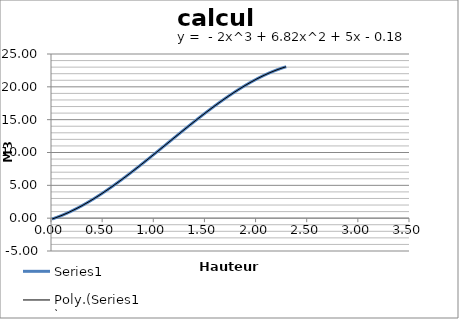
| Category | Series 0 |
|---|---|
| 0.01 | -0.129 |
| 0.02 | -0.077 |
| 0.03 | -0.024 |
| 0.04 | 0.031 |
| 0.05 | 0.087 |
| 0.06 | 0.144 |
| 0.07 | 0.203 |
| 0.08 | 0.263 |
| 0.09 | 0.324 |
| 0.1 | 0.386 |
| 0.11 | 0.45 |
| 0.12 | 0.515 |
| 0.13 | 0.581 |
| 0.14 | 0.648 |
| 0.15 | 0.717 |
| 0.16 | 0.786 |
| 0.17 | 0.857 |
| 0.18 | 0.929 |
| 0.19 | 1.002 |
| 0.2 | 1.077 |
| 0.21 | 1.152 |
| 0.22 | 1.229 |
| 0.23 | 1.306 |
| 0.24 | 1.385 |
| 0.25 | 1.465 |
| 0.26 | 1.546 |
| 0.27 | 1.628 |
| 0.28 | 1.711 |
| 0.29 | 1.795 |
| 0.3 | 1.88 |
| 0.31 | 1.966 |
| 0.32 | 2.053 |
| 0.33 | 2.141 |
| 0.34 | 2.23 |
| 0.35 | 2.32 |
| 0.36 | 2.411 |
| 0.37 | 2.502 |
| 0.38 | 2.595 |
| 0.39 | 2.689 |
| 0.4 | 2.783 |
| 0.41 | 2.879 |
| 0.42 | 2.975 |
| 0.43 | 3.072 |
| 0.44 | 3.17 |
| 0.45 | 3.269 |
| 0.46 | 3.368 |
| 0.47 | 3.469 |
| 0.48 | 3.57 |
| 0.49 | 3.672 |
| 0.5 | 3.775 |
| 0.51 | 3.879 |
| 0.52 | 3.983 |
| 0.53 | 4.088 |
| 0.54 | 4.194 |
| 0.55 | 4.3 |
| 0.56 | 4.408 |
| 0.57 | 4.515 |
| 0.58 | 4.624 |
| 0.59 | 4.733 |
| 0.6 | 4.843 |
| 0.61 | 4.954 |
| 0.62 | 5.065 |
| 0.63 | 5.177 |
| 0.64 | 5.289 |
| 0.65 | 5.402 |
| 0.66 | 5.516 |
| 0.67 | 5.63 |
| 0.68 | 5.745 |
| 0.69 | 5.86 |
| 0.7 | 5.976 |
| 0.71 | 6.092 |
| 0.72 | 6.209 |
| 0.73 | 6.326 |
| 0.74 | 6.444 |
| 0.75 | 6.562 |
| 0.76 | 6.681 |
| 0.77 | 6.801 |
| 0.78 | 6.92 |
| 0.79 | 7.04 |
| 0.8 | 7.161 |
| 0.81 | 7.282 |
| 0.82 | 7.403 |
| 0.83 | 7.525 |
| 0.84 | 7.647 |
| 0.85 | 7.769 |
| 0.86 | 7.892 |
| 0.87 | 8.015 |
| 0.88 | 8.138 |
| 0.89 | 8.262 |
| 0.9 | 8.386 |
| 0.91 | 8.51 |
| 0.92 | 8.635 |
| 0.93 | 8.76 |
| 0.94 | 8.885 |
| 0.95 | 9.01 |
| 0.96 | 9.136 |
| 0.97 | 9.262 |
| 0.98 | 9.388 |
| 0.99 | 9.514 |
| 1.0 | 9.64 |
| 1.01 | 9.766 |
| 1.02 | 9.893 |
| 1.03 | 10.02 |
| 1.04 | 10.147 |
| 1.05 | 10.274 |
| 1.06 | 10.401 |
| 1.07 | 10.528 |
| 1.08 | 10.655 |
| 1.09 | 10.783 |
| 1.1 | 10.91 |
| 1.11 | 11.038 |
| 1.12 | 11.165 |
| 1.13 | 11.293 |
| 1.14 | 11.42 |
| 1.15 | 11.548 |
| 1.16 | 11.675 |
| 1.17 | 11.803 |
| 1.18 | 11.93 |
| 1.19 | 12.057 |
| 1.2 | 12.185 |
| 1.21 | 12.312 |
| 1.22 | 12.439 |
| 1.23 | 12.566 |
| 1.24 | 12.693 |
| 1.25 | 12.82 |
| 1.26 | 12.947 |
| 1.27 | 13.073 |
| 1.28 | 13.2 |
| 1.29 | 13.326 |
| 1.3 | 13.452 |
| 1.31 | 13.578 |
| 1.32 | 13.703 |
| 1.33 | 13.829 |
| 1.34 | 13.954 |
| 1.35 | 14.079 |
| 1.36 | 14.203 |
| 1.37 | 14.328 |
| 1.38 | 14.452 |
| 1.39 | 14.576 |
| 1.4 | 14.699 |
| 1.41 | 14.822 |
| 1.42 | 14.945 |
| 1.43 | 15.068 |
| 1.44 | 15.19 |
| 1.45 | 15.312 |
| 1.46 | 15.433 |
| 1.47 | 15.554 |
| 1.48 | 15.675 |
| 1.49 | 15.795 |
| 1.5 | 15.915 |
| 1.51 | 16.034 |
| 1.52 | 16.153 |
| 1.53 | 16.272 |
| 1.54 | 16.39 |
| 1.55 | 16.507 |
| 1.56 | 16.624 |
| 1.57 | 16.741 |
| 1.58 | 16.857 |
| 1.59 | 16.972 |
| 1.6 | 17.087 |
| 1.61 | 17.202 |
| 1.62 | 17.315 |
| 1.63 | 17.429 |
| 1.64 | 17.541 |
| 1.65 | 17.653 |
| 1.66 | 17.765 |
| 1.67 | 17.875 |
| 1.68 | 17.986 |
| 1.69 | 18.095 |
| 1.7 | 18.204 |
| 1.71 | 18.312 |
| 1.72 | 18.419 |
| 1.73 | 18.526 |
| 1.74 | 18.632 |
| 1.75 | 18.738 |
| 1.76 | 18.842 |
| 1.77 | 18.946 |
| 1.78 | 19.049 |
| 1.79 | 19.151 |
| 1.8 | 19.253 |
| 1.81 | 19.354 |
| 1.82 | 19.453 |
| 1.83 | 19.553 |
| 1.84 | 19.651 |
| 1.85 | 19.748 |
| 1.86 | 19.845 |
| 1.87 | 19.94 |
| 1.88 | 20.035 |
| 1.89 | 20.129 |
| 1.9 | 20.222 |
| 1.91 | 20.314 |
| 1.92 | 20.405 |
| 1.93 | 20.496 |
| 1.94 | 20.585 |
| 1.95 | 20.673 |
| 1.96 | 20.761 |
| 1.97 | 20.847 |
| 1.98 | 20.932 |
| 1.99 | 21.017 |
| 2.0 | 21.1 |
| 2.01 | 21.182 |
| 2.02 | 21.264 |
| 2.03 | 21.344 |
| 2.04 | 21.423 |
| 2.05 | 21.501 |
| 2.06 | 21.578 |
| 2.07 | 21.654 |
| 2.08 | 21.728 |
| 2.09 | 21.802 |
| 2.1 | 21.874 |
| 2.11 | 21.945 |
| 2.12 | 22.016 |
| 2.13 | 22.084 |
| 2.14 | 22.152 |
| 2.15 | 22.219 |
| 2.16 | 22.284 |
| 2.17 | 22.348 |
| 2.18 | 22.411 |
| 2.19 | 22.472 |
| 2.2 | 22.533 |
| 2.21 | 22.592 |
| 2.22 | 22.65 |
| 2.23 | 22.706 |
| 2.24 | 22.761 |
| 2.25 | 22.815 |
| 2.26 | 22.867 |
| 2.27 | 22.919 |
| 2.28 | 22.968 |
| 2.29 | 23.017 |
| 2.3 | 23.064 |